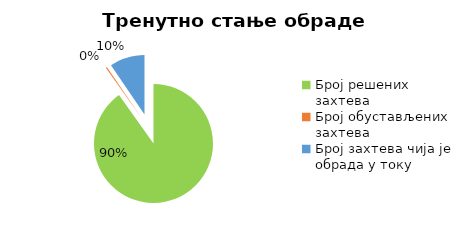
| Category | Series 0 |
|---|---|
| Број решених захтева | 26306 |
| Број обустављених захтева | 96 |
| Број захтева чија је обрада у току | 2777 |